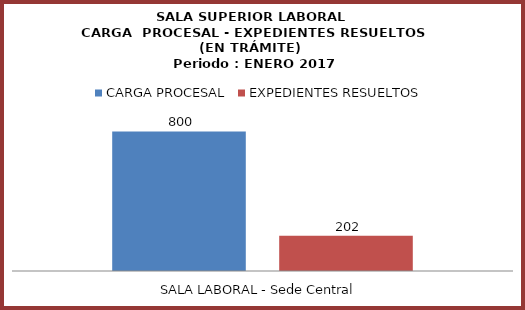
| Category | CARGA PROCESAL | EXPEDIENTES RESUELTOS |
|---|---|---|
| SALA LABORAL - Sede Central | 800 | 202 |